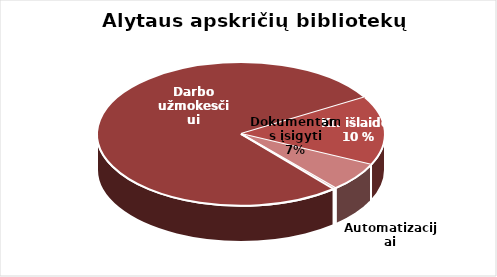
| Category | Series 0 |
|---|---|
| Darbo užmokesčiui | 2588119.5 |
| Kitos | 519661.29 |
| Dokumentams įsigyti | 218164.23 |
| Automatizacijai | 9116.47 |